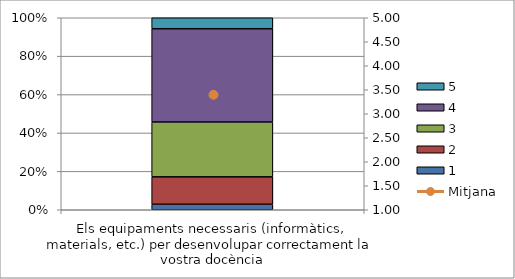
| Category | 1 | 2 | 3 | 4 | 5 |
|---|---|---|---|---|---|
| Els equipaments necessaris (informàtics, materials, etc.) per desenvolupar correctament la vostra docència | 1 | 5 | 10 | 17 | 2 |